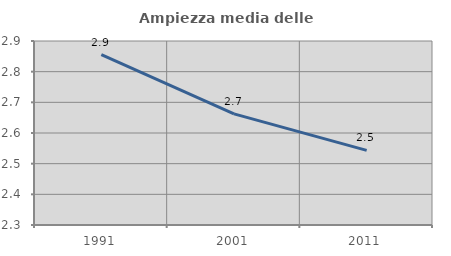
| Category | Ampiezza media delle famiglie |
|---|---|
| 1991.0 | 2.856 |
| 2001.0 | 2.662 |
| 2011.0 | 2.543 |